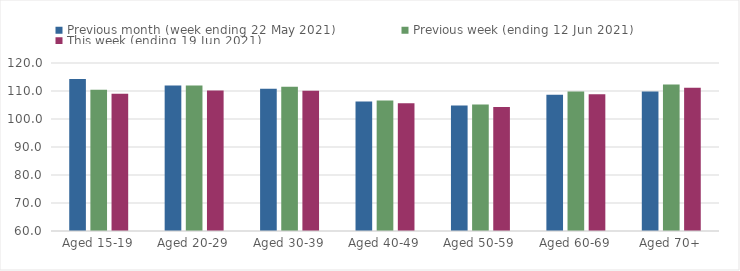
| Category | Previous month (week ending 22 May 2021) | Previous week (ending 12 Jun 2021) | This week (ending 19 Jun 2021) |
|---|---|---|---|
| Aged 15-19 | 114.32 | 110.44 | 109 |
| Aged 20-29 | 111.96 | 111.98 | 110.2 |
| Aged 30-39 | 110.79 | 111.48 | 110.08 |
| Aged 40-49 | 106.23 | 106.62 | 105.6 |
| Aged 50-59 | 104.83 | 105.21 | 104.28 |
| Aged 60-69 | 108.68 | 109.83 | 108.86 |
| Aged 70+ | 109.81 | 112.28 | 111.13 |